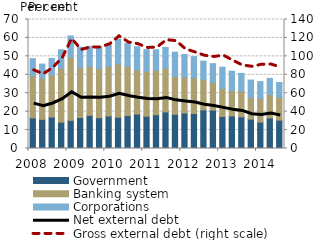
| Category | Government | Banking system | Corporations |
|---|---|---|---|
| 2008.0 | 16.608 | 22.925 | 9.223 |
| 2008.0 | 15.82 | 22.255 | 7.745 |
| 2008.0 | 17.064 | 22.789 | 9.011 |
| 2008.0 | 14.293 | 29.355 | 9.899 |
| 2009.0 | 15.261 | 34.267 | 11.534 |
| 2009.0 | 16.791 | 27.156 | 11.018 |
| 2009.0 | 17.974 | 26.589 | 10.865 |
| 2009.0 | 16.729 | 26.675 | 11.791 |
| 2010.0 | 17.609 | 26.906 | 11.672 |
| 2010.0 | 16.954 | 28.953 | 13.399 |
| 2010.0 | 17.832 | 26.637 | 12.563 |
| 2010.0 | 18.679 | 23.843 | 12.659 |
| 2011.0 | 17.503 | 24.382 | 11.75 |
| 2011.0 | 18.344 | 24.075 | 11.11 |
| 2011.0 | 19.846 | 23.641 | 11.331 |
| 2011.0 | 18.573 | 20.501 | 13.184 |
| 2012.0 | 19.241 | 19.38 | 12.372 |
| 2012.0 | 18.989 | 19.381 | 11.489 |
| 2012.0 | 20.922 | 16.517 | 10.001 |
| 2012.0 | 20.839 | 14.964 | 10.225 |
| 2013.0 | 17.396 | 15.203 | 11.507 |
| 2013.0 | 17.688 | 13.709 | 10.561 |
| 2013.0 | 17.178 | 13.979 | 9.598 |
| 2013.0 | 15.933 | 11.807 | 9.4 |
| 2014.0 | 14.296 | 12.799 | 9.221 |
| 2014.0 | 16.578 | 12.668 | 8.807 |
| 2014.0 | 15.405 | 12.291 | 8.121 |